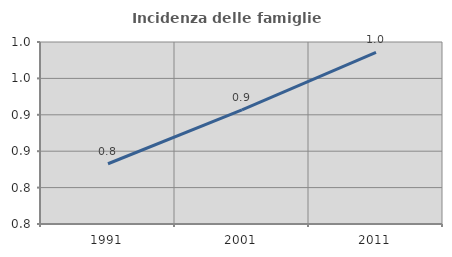
| Category | Incidenza delle famiglie numerose |
|---|---|
| 1991.0 | 0.833 |
| 2001.0 | 0.907 |
| 2011.0 | 0.986 |